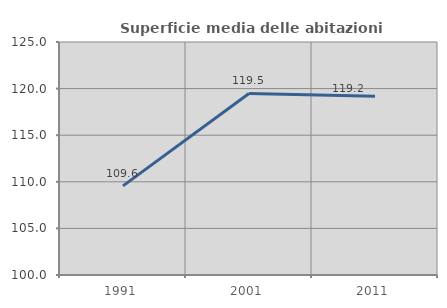
| Category | Superficie media delle abitazioni occupate |
|---|---|
| 1991.0 | 109.564 |
| 2001.0 | 119.475 |
| 2011.0 | 119.175 |